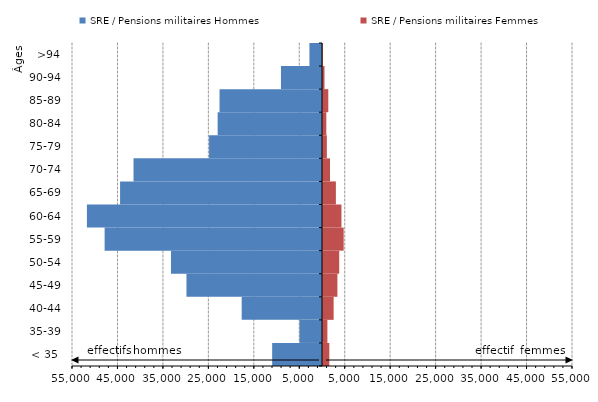
| Category | SRE / Pensions militaires Hommes | SRE / Pensions militaires Femmes |
|---|---|---|
| < 35  | -10965 | 1612 |
| 35-39 | -4953 | 1186 |
| 40-44 | -17665 | 2561 |
| 45-49 | -29816 | 3391 |
| 50-54 | -33220 | 3787 |
| 55-59 | -47820 | 4767 |
| 60-64 | -51719 | 4279 |
| 65-69 | -44424 | 3055 |
| 70-74 | -41465 | 1756 |
| 75-79 | -24845 | 1069 |
| 80-84 | -22957 | 949 |
| 85-89 | -22542 | 1388 |
| 90-94 | -9027 | 547 |
| >94 | -2766 | 199 |